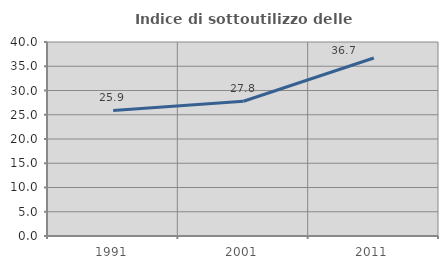
| Category | Indice di sottoutilizzo delle abitazioni  |
|---|---|
| 1991.0 | 25.879 |
| 2001.0 | 27.778 |
| 2011.0 | 36.703 |